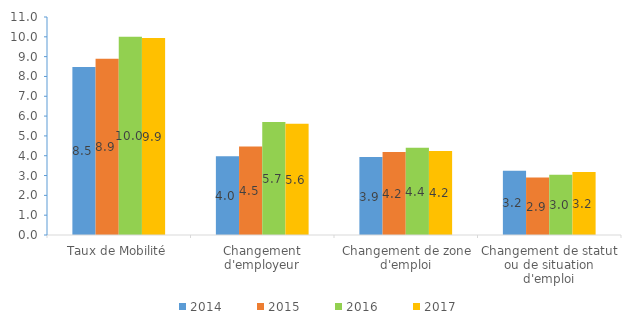
| Category | 2014 | 2015 | 2016 | 2017 |
|---|---|---|---|---|
| Taux de Mobilité | 8.482 | 8.888 | 10 | 9.935 |
| Changement d'employeur | 3.97 | 4.47 | 5.7 | 5.61 |
| Changement de zone d'emploi | 3.93 | 4.19 | 4.4 | 4.24 |
| Changement de statut ou de situation d'emploi | 3.24 | 2.9 | 3.04 | 3.18 |